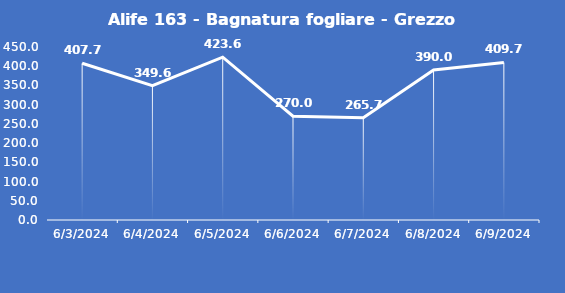
| Category | Alife 163 - Bagnatura fogliare - Grezzo (min) |
|---|---|
| 6/3/24 | 407.7 |
| 6/4/24 | 349.6 |
| 6/5/24 | 423.6 |
| 6/6/24 | 270 |
| 6/7/24 | 265.7 |
| 6/8/24 | 390 |
| 6/9/24 | 409.7 |